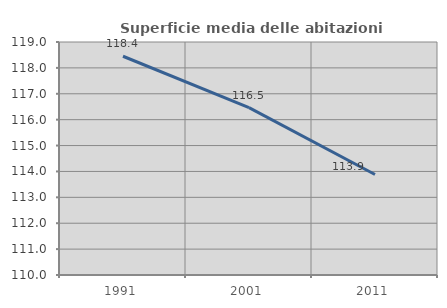
| Category | Superficie media delle abitazioni occupate |
|---|---|
| 1991.0 | 118.45 |
| 2001.0 | 116.467 |
| 2011.0 | 113.881 |